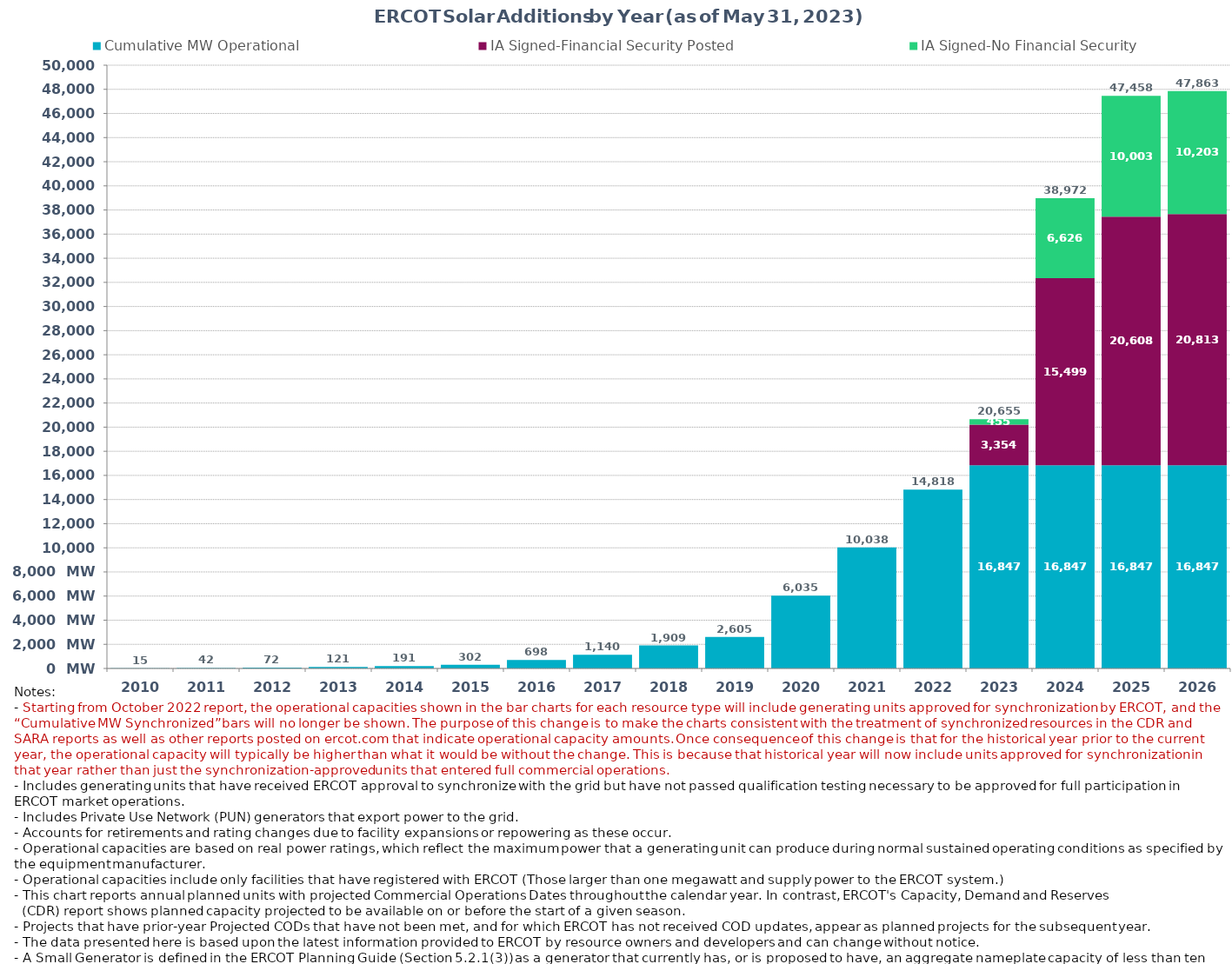
| Category | Cumulative MW Operational  | IA Signed-Financial Security Posted  | IA Signed-No Financial Security  | Small Generator | Cumulative Installed and Planned |
|---|---|---|---|---|---|
| 2010.0 | 14.9 | 0 | 0 | 0 | 14.9 |
| 2011.0 | 41.6 | 0 | 0 | 0 | 41.6 |
| 2012.0 | 72 | 0 | 0 | 0 | 72 |
| 2013.0 | 121.18 | 0 | 0 | 0 | 121.18 |
| 2014.0 | 190.7 | 0 | 0 | 0 | 190.7 |
| 2015.0 | 301.71 | 0 | 0 | 0 | 301.71 |
| 2016.0 | 698.22 | 0 | 0 | 0 | 698.22 |
| 2017.0 | 1140.12 | 0 | 0 | 0 | 1140.12 |
| 2018.0 | 1909.16 | 0 | 0 | 0 | 1909.16 |
| 2019.0 | 2605.35 | 0 | 0 | 0 | 2605.35 |
| 2020.0 | 6034.64 | 0 | 0 | 0 | 6034.64 |
| 2021.0 | 10038.12 | 0 | 0 | 0 | 10038.12 |
| 2022.0 | 14818.22 | 0 | 0 | 0 | 14818.22 |
| 2023.0 | 16846.57 | 3354.13 | 454.59 | 0 | 20655.29 |
| 2024.0 | 16846.57 | 15499.38 | 6626.39 | 0 | 38972.34 |
| 2025.0 | 16846.57 | 20607.85 | 10003.49 | 0 | 47457.91 |
| 2026.0 | 16846.57 | 20813.05 | 10203.49 | 0 | 47863.11 |